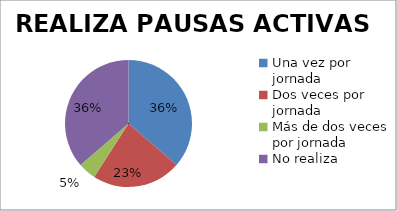
| Category | Series 0 |
|---|---|
| Una vez por jornada | 8 |
| Dos veces por jornada | 5 |
| Más de dos veces por jornada | 1 |
| No realiza | 8 |